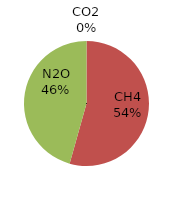
| Category | Series 0 |
|---|---|
| CO2 | 0 |
| CH4 | 2346.711 |
| N2O | 1970.28 |